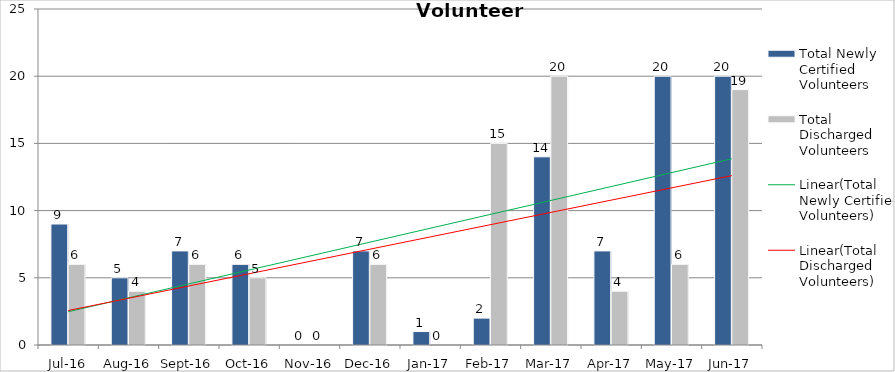
| Category | Total Newly Certified Volunteers | Total Discharged Volunteers |
|---|---|---|
| Jul-16 | 9 | 6 |
| Aug-16 | 5 | 4 |
| Sep-16 | 7 | 6 |
| Oct-16 | 6 | 5 |
| Nov-16 | 0 | 0 |
| Dec-16 | 7 | 6 |
| Jan-17 | 1 | 0 |
| Feb-17 | 2 | 15 |
| Mar-17 | 14 | 20 |
| Apr-17 | 7 | 4 |
| May-17 | 20 | 6 |
| Jun-17 | 20 | 19 |